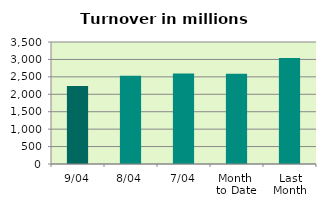
| Category | Series 0 |
|---|---|
| 9/04 | 2239.028 |
| 8/04 | 2531.314 |
| 7/04 | 2597.367 |
| Month 
to Date | 2589.97 |
| Last
Month | 3040.277 |